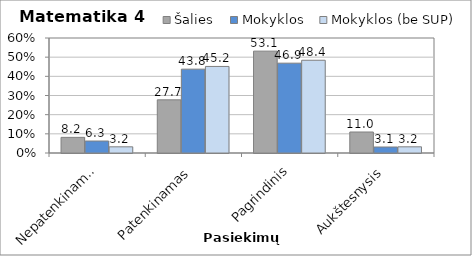
| Category | Šalies | Mokyklos | Mokyklos (be SUP) |
|---|---|---|---|
| Nepatenkinamas | 8.159 | 6.25 | 3.226 |
| Patenkinamas | 27.739 | 43.75 | 45.161 |
| Pagrindinis | 53.147 | 46.875 | 48.387 |
| Aukštesnysis | 10.956 | 3.125 | 3.226 |